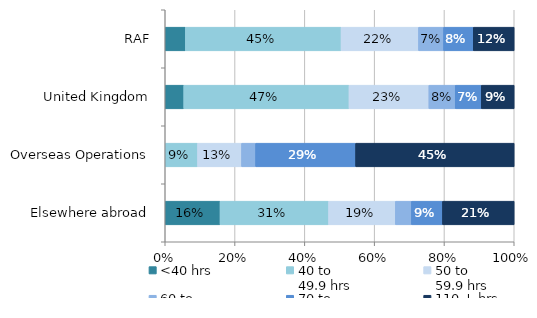
| Category | <40 hrs | 40 to 
49.9 hrs | 50 to 
59.9 hrs | 60 to 
69.9 hrs | 70 to 
109.9 hrs | 110 + hrs |
|---|---|---|---|---|---|---|
| RAF | 0.058 | 0.446 | 0.222 | 0.072 | 0.085 | 0.117 |
| United Kingdom | 0.053 | 0.474 | 0.229 | 0.075 | 0.075 | 0.094 |
| Overseas Operations | 0 | 0.093 | 0.126 | 0.04 | 0.287 | 0.454 |
| Elsewhere abroad | 0.157 | 0.311 | 0.191 | 0.046 | 0.089 | 0.206 |